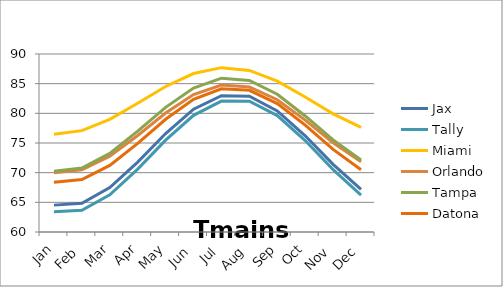
| Category | Jax | Tally | Miami | Orlando | Tampa | Datona |
|---|---|---|---|---|---|---|
| Jan | 64.53 | 63.43 | 76.48 | 69.98 | 70.22 | 68.4 |
| Feb | 64.85 | 63.67 | 77.08 | 70.47 | 70.78 | 68.84 |
| Mar | 67.5 | 66.28 | 78.98 | 72.76 | 73.25 | 71.23 |
| Apr | 71.79 | 70.6 | 81.7 | 76.26 | 76.99 | 74.93 |
| May | 76.6 | 75.49 | 84.52 | 80.06 | 81.01 | 79 |
| Jun | 80.69 | 79.67 | 86.71 | 83.17 | 84.27 | 82.36 |
| Jul | 82.98 | 82.07 | 87.7 | 84.77 | 85.93 | 84.14 |
| Aug | 82.88 | 82.05 | 87.23 | 84.45 | 85.54 | 83.88 |
| Sep | 80.41 | 79.62 | 85.42 | 82.29 | 83.22 | 81.64 |
| Oct | 76.22 | 75.41 | 82.75 | 78.86 | 79.56 | 78.01 |
| Nov | 71.39 | 70.52 | 79.91 | 75.05 | 75.52 | 73.93 |
| Dec | 67.2 | 66.23 | 77.64 | 71.85 | 72.15 | 70.48 |